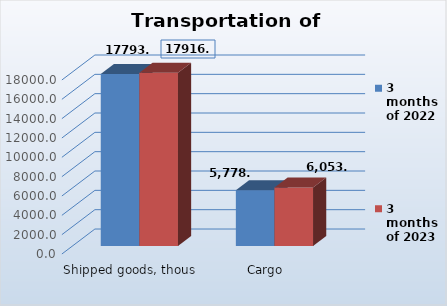
| Category | 3 months of 2022 | 3 months of 2023 |
|---|---|---|
| Shipped goods, thous. tons | 17793.4 | 17916.9 |
| Cargo turnover, mln.t.km | 5778.4 | 6053.9 |